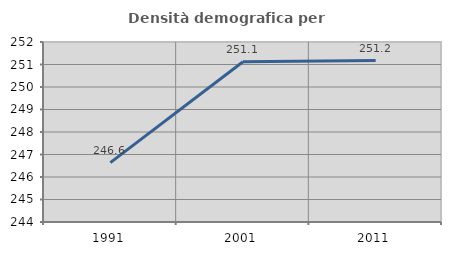
| Category | Densità demografica |
|---|---|
| 1991.0 | 246.637 |
| 2001.0 | 251.121 |
| 2011.0 | 251.177 |